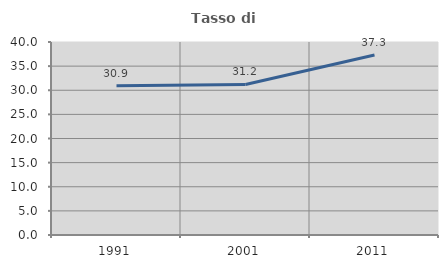
| Category | Tasso di occupazione   |
|---|---|
| 1991.0 | 30.947 |
| 2001.0 | 31.209 |
| 2011.0 | 37.303 |